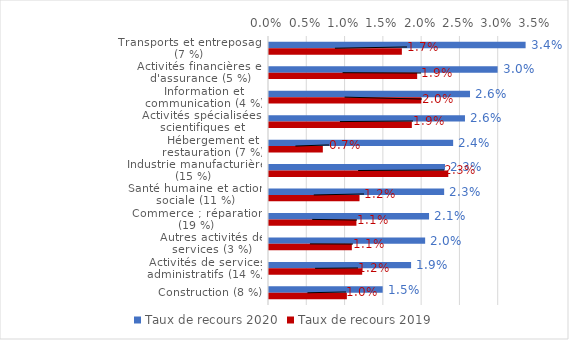
| Category | Taux de recours 2020 | Taux de recours 2019 |
|---|---|---|
| Transports et entreposage (7 %) | 0.034 | 0.017 |
| Activités financières et d'assurance (5 %) | 0.03 | 0.019 |
| Information et communication (4 %) | 0.026 | 0.02 |
| Activités spécialisées, scientifiques et techniques (8 %) | 0.026 | 0.019 |
| Hébergement et restauration (7 %) | 0.024 | 0.007 |
| Industrie manufacturière (15 %) | 0.023 | 0.023 |
| Santé humaine et action sociale (11 %) | 0.023 | 0.012 |
| Commerce ; réparation  (19 %) | 0.021 | 0.011 |
| Autres activités de services (3 %) | 0.02 | 0.011 |
| Activités de services administratifs (14 %) | 0.019 | 0.012 |
| Construction (8 %) | 0.015 | 0.01 |